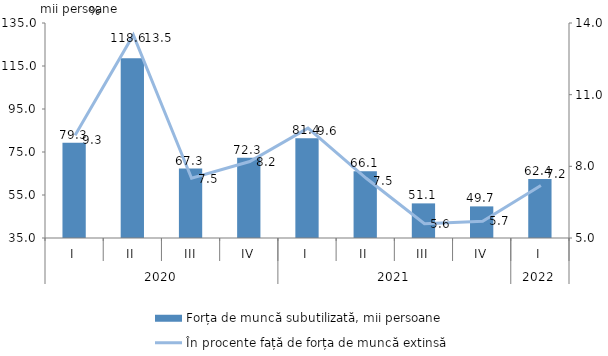
| Category | Forța de muncă subutilizată, mii persoane |
|---|---|
| 0 | 79.3 |
| 1 | 118.6 |
| 2 | 67.3 |
| 3 | 72.3 |
| 4 | 81.4 |
| 5 | 66.1 |
| 6 | 51.1 |
| 7 | 49.7 |
| 8 | 62.4 |